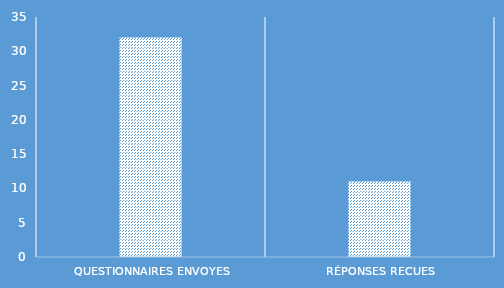
| Category | Series 0 |
|---|---|
| QUESTIONNAIRES ENVOYES | 32 |
| Réponses recues | 11 |